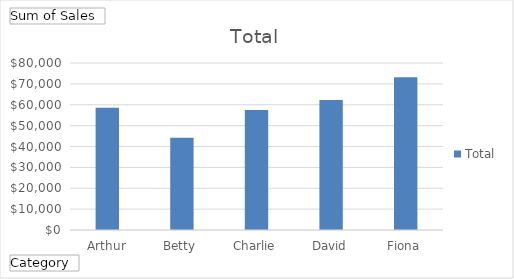
| Category | Total |
|---|---|
| Arthur | 58604 |
| Betty | 44215 |
| Charlie | 57490 |
| David | 62268 |
| Fiona | 73173 |